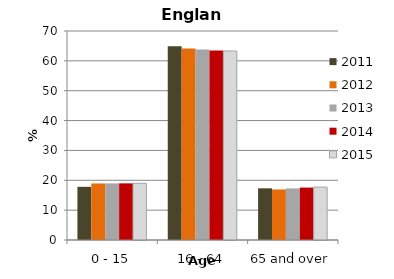
| Category | 2011 | 2012 | 2013 | 2014 | 2015 |
|---|---|---|---|---|---|
| 0 - 15 | 17.807 | 18.937 | 18.953 | 18.969 | 18.992 |
| 16 - 64 | 64.884 | 64.133 | 63.772 | 63.471 | 63.3 |
| 65 and over | 17.309 | 16.93 | 17.275 | 17.559 | 17.726 |